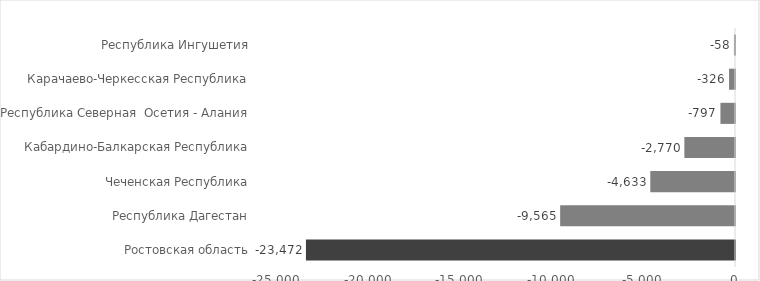
| Category | Series 0 |
|---|---|
| Ростовская область | -23472 |
| Республика Дагестан | -9565 |
| Чеченская Республика | -4633 |
| Кабардино-Балкарская Республика | -2770 |
| Республика Северная  Осетия - Алания | -797 |
| Карачаево-Черкесская Республика | -326 |
| Республика Ингушетия | -58 |